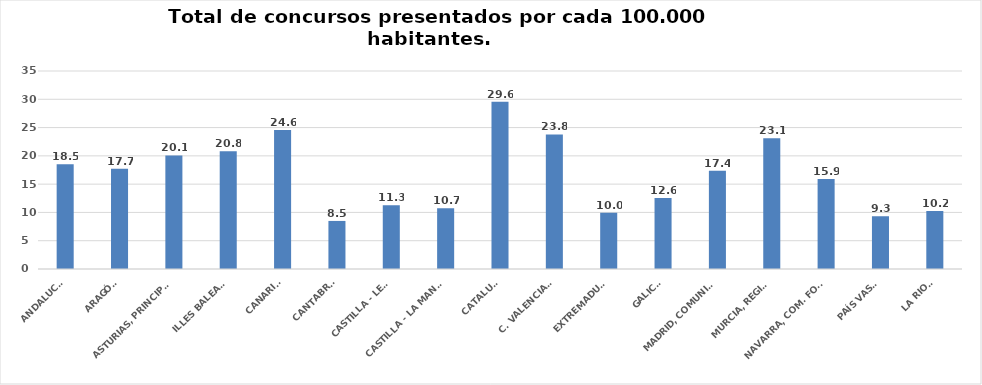
| Category | Series 0 |
|---|---|
| ANDALUCÍA | 18.536 |
| ARAGÓN | 17.713 |
| ASTURIAS, PRINCIPADO | 20.067 |
| ILLES BALEARS | 20.8 |
| CANARIAS | 24.583 |
| CANTABRIA | 8.496 |
| CASTILLA - LEÓN | 11.29 |
| CASTILLA - LA MANCHA | 10.718 |
| CATALUÑA | 29.56 |
| C. VALENCIANA | 23.782 |
| EXTREMADURA | 9.959 |
| GALICIA | 12.557 |
| MADRID, COMUNIDAD | 17.39 |
| MURCIA, REGIÓN | 23.121 |
| NAVARRA, COM. FORAL | 15.918 |
| PAÍS VASCO | 9.325 |
| LA RIOJA | 10.24 |